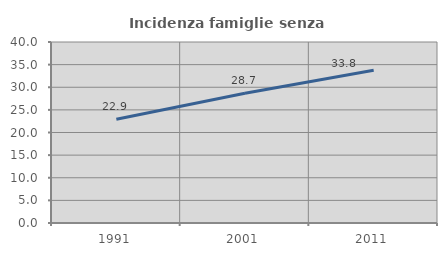
| Category | Incidenza famiglie senza nuclei |
|---|---|
| 1991.0 | 22.917 |
| 2001.0 | 28.659 |
| 2011.0 | 33.768 |